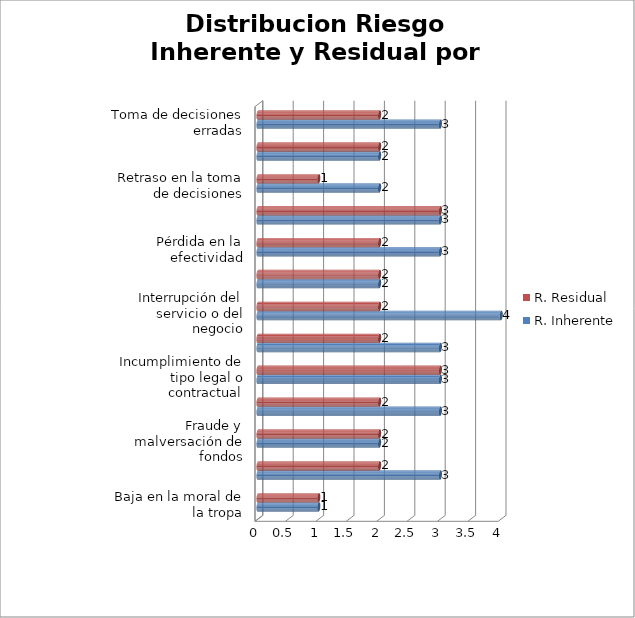
| Category | R. Inherente | R. Residual |
|---|---|---|
| Baja en la moral de la tropa | 1 | 1 |
| Deterioro de la imagen pública. | 3 | 2 |
| Fraude y malversación de fondos | 2 | 2 |
| Fuga de información | 3 | 2 |
| Incumplimiento de tipo legal o contractual | 3 | 3 |
| Indisponibilidad colateral de otros servicios | 3 | 2 |
| Interrupción del servicio o del negocio | 4 | 2 |
| Pérdida de productividad de los empleados | 2 | 2 |
| Pérdida en la efectividad | 3 | 2 |
| Perjuicio a la relaciones de la Entidad con otros organismos | 3 | 3 |
| Retraso en la toma de decisiones | 2 | 1 |
| Sanciones | 2 | 2 |
| Toma de decisiones erradas | 3 | 2 |